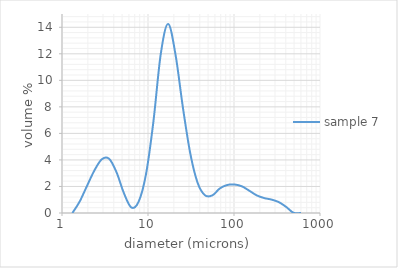
| Category | sample 7 |
|---|---|
| 1.32 | 0 |
| 1.6 | 0.847 |
| 1.95 | 2.031 |
| 2.38 | 3.206 |
| 2.9 | 4.046 |
| 3.53 | 4.088 |
| 4.3 | 3.08 |
| 5.24 | 1.506 |
| 6.39 | 0.421 |
| 7.78 | 0.851 |
| 9.48 | 2.928 |
| 11.55 | 6.874 |
| 14.08 | 11.997 |
| 17.15 | 14.253 |
| 20.9 | 11.931 |
| 25.46 | 7.951 |
| 31.01 | 4.492 |
| 37.79 | 2.264 |
| 46.03 | 1.335 |
| 56.09 | 1.331 |
| 68.33 | 1.849 |
| 83.26 | 2.11 |
| 101.44 | 2.149 |
| 123.59 | 2.009 |
| 150.57001 | 1.68 |
| 183.44 | 1.333 |
| 223.50999 | 1.128 |
| 272.31 | 1.014 |
| 331.76999 | 0.822 |
| 404.20999 | 0.459 |
| 492.47 | 0.016 |
| 600.0 | 0 |